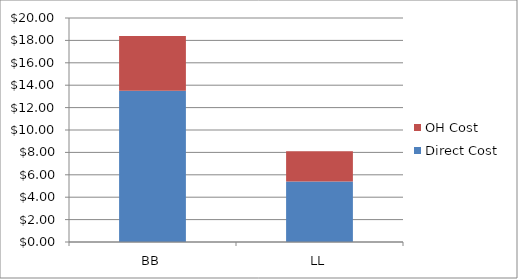
| Category | Direct Cost | OH Cost |
|---|---|---|
| BB | 13.5 | 4.898 |
| LL | 5.4 | 2.694 |